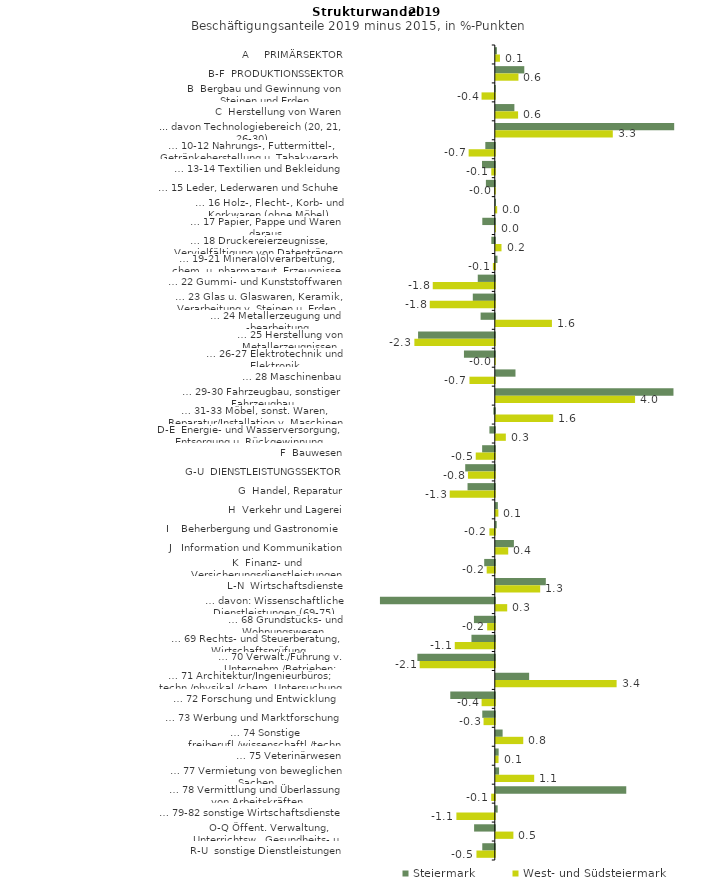
| Category | Steiermark | West- und Südsteiermark |
|---|---|---|
| A     PRIMÄRSEKTOR | 0.031 | 0.118 |
| B-F  PRODUKTIONSSEKTOR | 0.809 | 0.643 |
| B  Bergbau und Gewinnung von Steinen und Erden | -0.014 | -0.377 |
| C  Herstellung von Waren | 0.528 | 0.633 |
| ... davon Technologiebereich (20, 21, 26-30) | 5.068 | 3.324 |
| … 10-12 Nahrungs-, Futtermittel-, Getränkeherstellung u. Tabakverarb. | -0.269 | -0.743 |
| … 13-14 Textilien und Bekleidung | -0.363 | -0.1 |
| … 15 Leder, Lederwaren und Schuhe | -0.253 | -0.02 |
| … 16 Holz-, Flecht-, Korb- und Korkwaren (ohne Möbel)  | 0.005 | 0.039 |
| … 17 Papier, Pappe und Waren daraus  | -0.355 | 0.003 |
| … 18 Druckereierzeugnisse, Vervielfältigung von Datenträgern | -0.098 | 0.162 |
| … 19-21 Mineralölverarbeitung, chem. u. pharmazeut. Erzeugnisse | 0.048 | -0.055 |
| … 22 Gummi- und Kunststoffwaren | -0.484 | -1.763 |
| … 23 Glas u. Glaswaren, Keramik, Verarbeitung v. Steinen u. Erden  | -0.625 | -1.848 |
| … 24 Metallerzeugung und -bearbeitung | -0.403 | 1.594 |
| … 25 Herstellung von Metallerzeugnissen  | -2.18 | -2.285 |
| … 26-27 Elektrotechnik und Elektronik | -0.876 | -0.011 |
| … 28 Maschinenbau | 0.559 | -0.72 |
| … 29-30 Fahrzeugbau, sonstiger Fahrzeugbau | 5.047 | 3.956 |
| … 31-33 Möbel, sonst. Waren, Reparatur/Installation v. Maschinen | -0.041 | 1.631 |
| D-E  Energie- und Wasserversorgung, Entsorgung u. Rückgewinnung | -0.153 | 0.285 |
| F  Bauwesen | -0.36 | -0.542 |
| G-U  DIENSTLEISTUNGSSEKTOR | -0.84 | -0.763 |
| G  Handel, Reparatur | -0.775 | -1.28 |
| H  Verkehr und Lagerei | 0.059 | 0.073 |
| I    Beherbergung und Gastronomie | 0.026 | -0.153 |
| J   Information und Kommunikation | 0.514 | 0.353 |
| K  Finanz- und Versicherungsdienstleistungen | -0.301 | -0.23 |
| L-N  Wirtschaftsdienste | 1.421 | 1.26 |
| … davon: Wissenschaftliche Dienstleistungen (69-75) | -3.263 | 0.324 |
| … 68 Grundstücks- und Wohnungswesen  | -0.593 | -0.217 |
| … 69 Rechts- und Steuerberatung, Wirtschaftsprüfung | -0.663 | -1.137 |
| … 70 Verwalt./Führung v. Unternehm./Betrieben; Unternehmensberat. | -2.199 | -2.134 |
| … 71 Architektur/Ingenieurbüros; techn./physikal./chem. Untersuchung | 0.947 | 3.432 |
| … 72 Forschung und Entwicklung  | -1.265 | -0.375 |
| … 73 Werbung und Marktforschung | -0.356 | -0.32 |
| … 74 Sonstige freiberufl./wissenschaftl./techn. Tätigkeiten | 0.194 | 0.78 |
| … 75 Veterinärwesen | 0.081 | 0.077 |
| … 77 Vermietung von beweglichen Sachen  | 0.093 | 1.091 |
| … 78 Vermittlung und Überlassung von Arbeitskräften | 3.706 | -0.102 |
| … 79-82 sonstige Wirtschaftsdienste | 0.053 | -1.091 |
| O-Q Öffent. Verwaltung, Unterrichtsw., Gesundheits- u. Sozialwesen | -0.588 | 0.5 |
| R-U  sonstige Dienstleistungen | -0.356 | -0.521 |